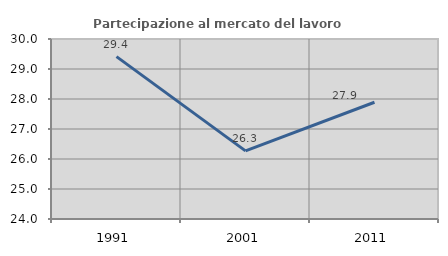
| Category | Partecipazione al mercato del lavoro  femminile |
|---|---|
| 1991.0 | 29.412 |
| 2001.0 | 26.271 |
| 2011.0 | 27.891 |